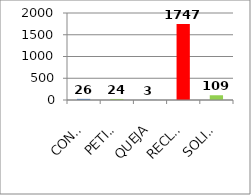
| Category | Series 0 |
|---|---|
| CONSULTA | 26 |
| PETICIÒN INFORMATIVA | 24 |
| QUEJA | 3 |
| RECLAMO | 1747 |
| SOLICITUD | 109 |